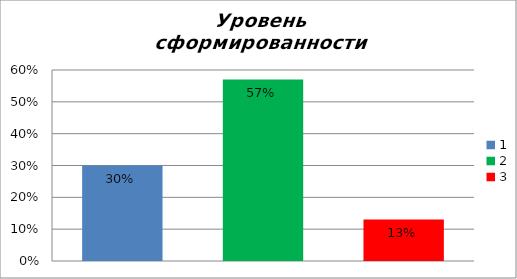
| Category | Уровень сформированности предметных результатов |
|---|---|
| 0 | 0.3 |
| 1 | 0.57 |
| 2 | 0.13 |